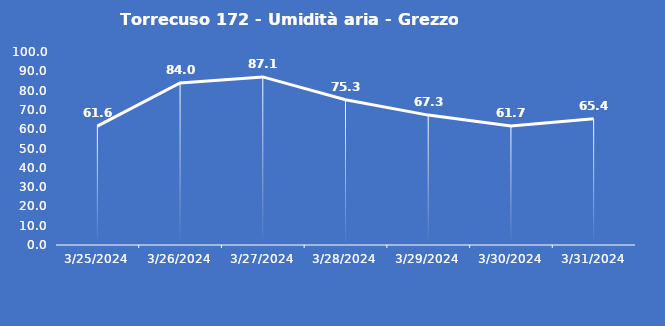
| Category | Torrecuso 172 - Umidità aria - Grezzo (%) |
|---|---|
| 3/25/24 | 61.6 |
| 3/26/24 | 84 |
| 3/27/24 | 87.1 |
| 3/28/24 | 75.3 |
| 3/29/24 | 67.3 |
| 3/30/24 | 61.7 |
| 3/31/24 | 65.4 |